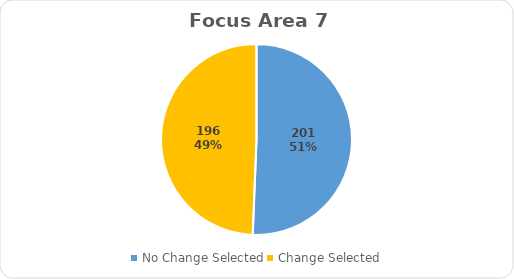
| Category | Series 0 |
|---|---|
| No Change Selected | 201 |
| Change Selected | 196 |